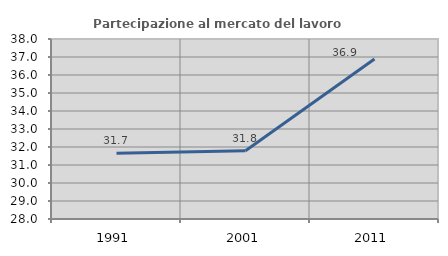
| Category | Partecipazione al mercato del lavoro  femminile |
|---|---|
| 1991.0 | 31.653 |
| 2001.0 | 31.792 |
| 2011.0 | 36.886 |